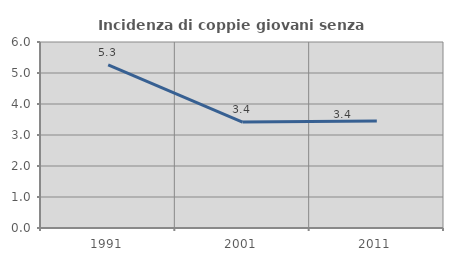
| Category | Incidenza di coppie giovani senza figli |
|---|---|
| 1991.0 | 5.263 |
| 2001.0 | 3.419 |
| 2011.0 | 3.448 |